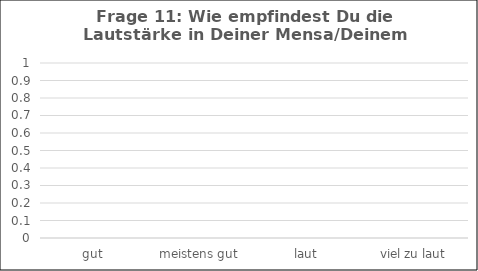
| Category | Series 0 |
|---|---|
| gut | 0 |
| meistens gut | 0 |
| laut | 0 |
| viel zu laut | 0 |